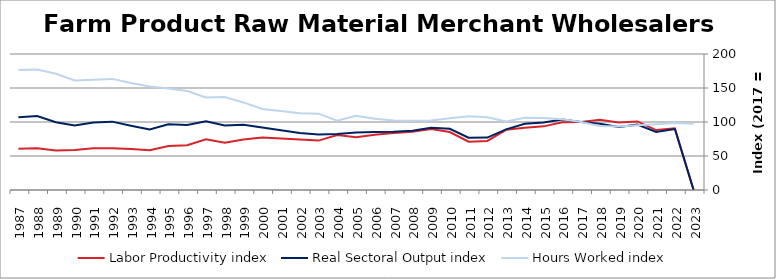
| Category | Labor Productivity index | Real Sectoral Output index | Hours Worked index |
|---|---|---|---|
| 2023.0 | 0 | 0 | 97.351 |
| 2022.0 | 90.881 | 89.681 | 98.68 |
| 2021.0 | 88.171 | 85.355 | 96.806 |
| 2020.0 | 100.891 | 96.117 | 95.268 |
| 2019.0 | 99.138 | 92.552 | 93.357 |
| 2018.0 | 103.331 | 97.343 | 94.205 |
| 2017.0 | 100 | 100 | 100 |
| 2016.0 | 99.679 | 103.68 | 104.013 |
| 2015.0 | 93.596 | 99.193 | 105.98 |
| 2014.0 | 91.677 | 97.535 | 106.39 |
| 2013.0 | 88.547 | 89.209 | 100.748 |
| 2012.0 | 72.135 | 77.085 | 106.862 |
| 2011.0 | 70.948 | 76.933 | 108.435 |
| 2010.0 | 85.258 | 90.079 | 105.655 |
| 2009.0 | 89.691 | 91.584 | 102.11 |
| 2008.0 | 85.583 | 87.176 | 101.861 |
| 2007.0 | 83.738 | 85.647 | 102.28 |
| 2006.0 | 81.293 | 85.236 | 104.85 |
| 2005.0 | 77.548 | 84.538 | 109.014 |
| 2004.0 | 80.726 | 82.289 | 101.936 |
| 2003.0 | 72.63 | 81.565 | 112.302 |
| 2002.0 | 74.366 | 83.86 | 112.766 |
| 2001.0 | 75.775 | 87.926 | 116.037 |
| 2000.0 | 77.242 | 92.055 | 119.177 |
| 1999.0 | 74.389 | 95.811 | 128.798 |
| 1998.0 | 69.437 | 94.953 | 136.747 |
| 1997.0 | 74.429 | 101.174 | 135.934 |
| 1996.0 | 65.837 | 95.763 | 145.454 |
| 1995.0 | 64.762 | 96.624 | 149.199 |
| 1994.0 | 58.381 | 88.888 | 152.255 |
| 1993.0 | 60.13 | 94.594 | 157.317 |
| 1992.0 | 61.533 | 100.537 | 163.388 |
| 1991.0 | 61.219 | 99.201 | 162.042 |
| 1990.0 | 58.97 | 94.914 | 160.954 |
| 1989.0 | 58.206 | 99.56 | 171.05 |
| 1988.0 | 61.426 | 108.845 | 177.196 |
| 1987.0 | 60.582 | 106.946 | 176.532 |